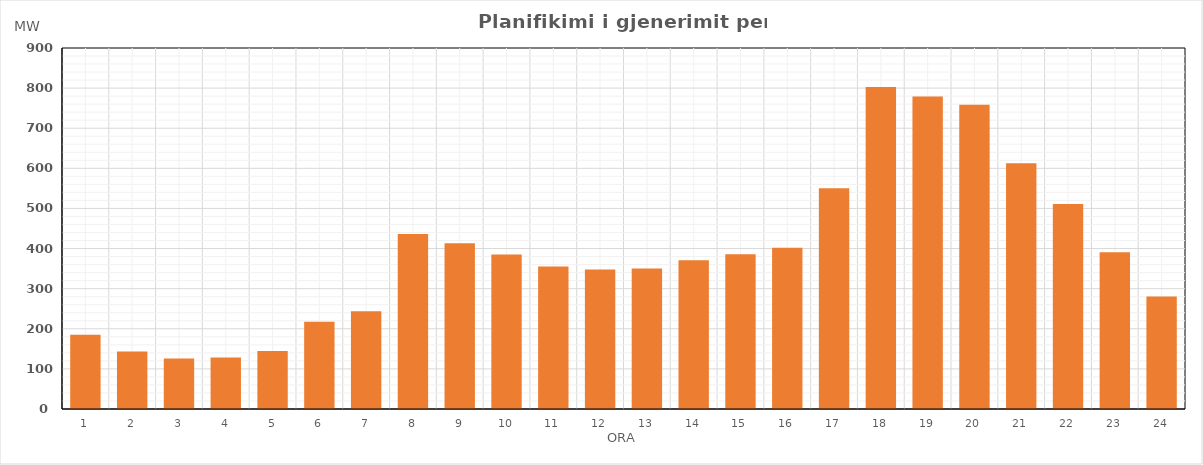
| Category | Max (MW) |
|---|---|
| 0 | 185.378 |
| 1 | 143.65 |
| 2 | 125.71 |
| 3 | 128.51 |
| 4 | 144.39 |
| 5 | 217.514 |
| 6 | 243.96 |
| 7 | 436.254 |
| 8 | 413.33 |
| 9 | 385.148 |
| 10 | 355.269 |
| 11 | 347.915 |
| 12 | 350.286 |
| 13 | 370.587 |
| 14 | 386.049 |
| 15 | 402.208 |
| 16 | 550.425 |
| 17 | 802.985 |
| 18 | 779.084 |
| 19 | 758.746 |
| 20 | 612.478 |
| 21 | 510.926 |
| 22 | 390.894 |
| 23 | 280.284 |